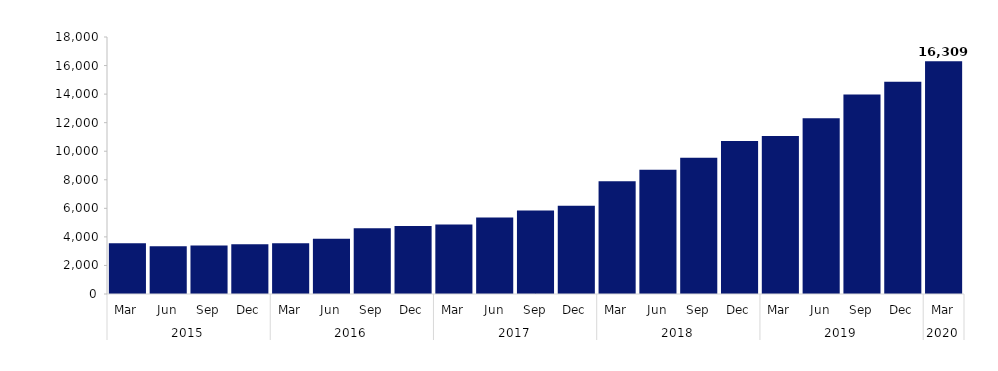
| Category | Series 0 |
|---|---|
| 0 | 3562 |
| 1 | 3352 |
| 2 | 3399 |
| 3 | 3476 |
| 4 | 3549 |
| 5 | 3877 |
| 6 | 4602 |
| 7 | 4771 |
| 8 | 4865 |
| 9 | 5353 |
| 10 | 5844 |
| 11 | 6182 |
| 12 | 7890 |
| 13 | 8704 |
| 14 | 9536 |
| 15 | 10712 |
| 16 | 11067 |
| 17 | 12311 |
| 18 | 13966 |
| 19 | 14869 |
| 20 | 16309 |